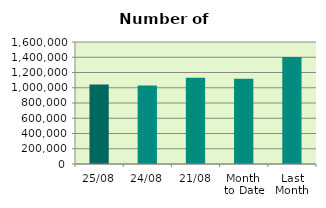
| Category | Series 0 |
|---|---|
| 25/08 | 1041852 |
| 24/08 | 1028498 |
| 21/08 | 1131450 |
| Month 
to Date | 1118534.471 |
| Last
Month | 1404253.739 |